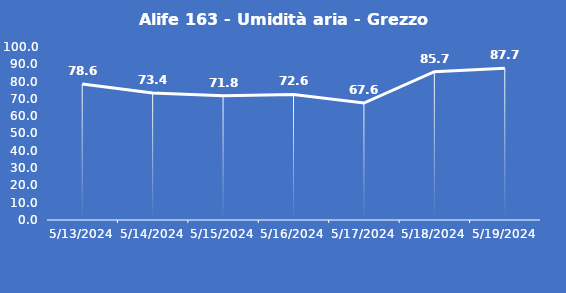
| Category | Alife 163 - Umidità aria - Grezzo (%) |
|---|---|
| 5/13/24 | 78.6 |
| 5/14/24 | 73.4 |
| 5/15/24 | 71.8 |
| 5/16/24 | 72.6 |
| 5/17/24 | 67.6 |
| 5/18/24 | 85.7 |
| 5/19/24 | 87.7 |